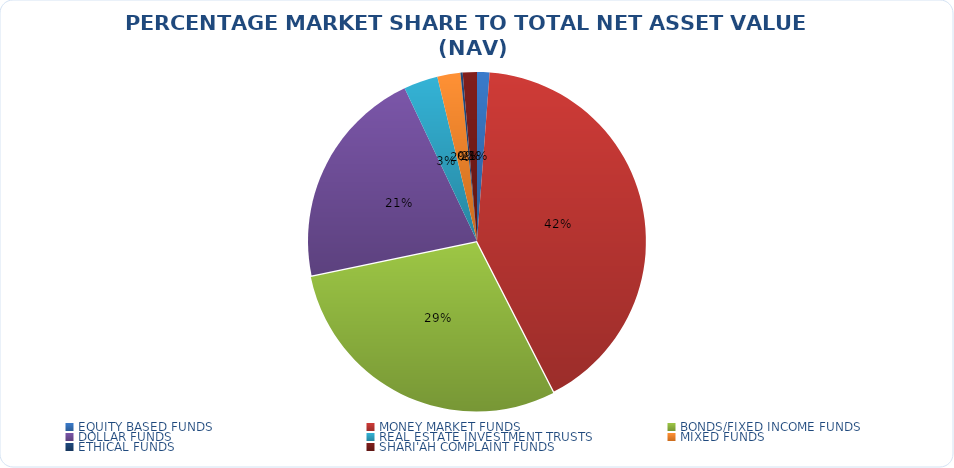
| Category | NET ASSET VALUE |
|---|---|
| EQUITY BASED FUNDS | 16644357010.51 |
| MONEY MARKET FUNDS | 574457274222.394 |
| BONDS/FIXED INCOME FUNDS | 407293748070.26 |
| DOLLAR FUNDS | 295362285727.437 |
| REAL ESTATE INVESTMENT TRUSTS | 45509389435.75 |
| MIXED FUNDS | 30731548032.112 |
| ETHICAL FUNDS | 2958693174.39 |
| SHARI'AH COMPLAINT FUNDS | 18831698938.24 |